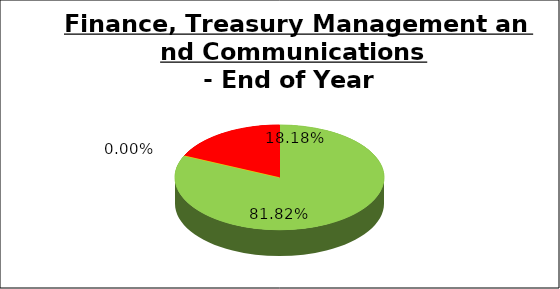
| Category | Q4 |
|---|---|
| Green | 0.818 |
| Amber | 0 |
| Red | 0.182 |